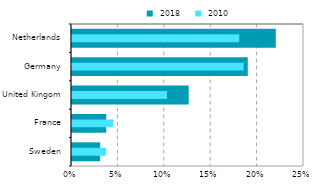
| Category |  2018 |
|---|---|
| Sweden | 0.03 |
| France | 0.037 |
| United Kingom | 0.126 |
| Germany | 0.189 |
| Netherlands | 0.22 |